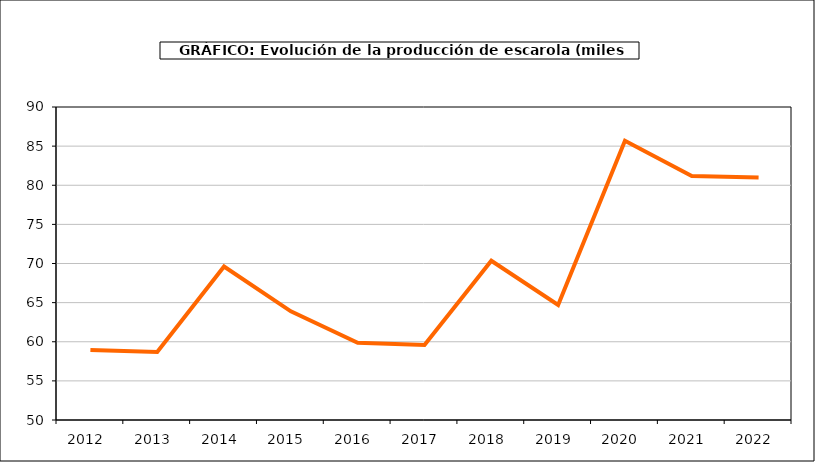
| Category | producción |
|---|---|
| 2012.0 | 58.957 |
| 2013.0 | 58.687 |
| 2014.0 | 69.619 |
| 2015.0 | 63.882 |
| 2016.0 | 59.873 |
| 2017.0 | 59.587 |
| 2018.0 | 70.347 |
| 2019.0 | 64.693 |
| 2020.0 | 85.687 |
| 2021.0 | 81.183 |
| 2022.0 | 81 |